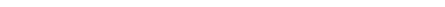
| Category | budget | end of year projected spend |
|---|---|---|
| clerk | 9000 | 17808.88 |
| Admin | 2000 | 1879.48 |
| St Michaels | 290 | 15788.653 |
| RBWM | 200 | 0 |
| greens | 10000 | 1805.933 |
| insurance | 2000 | 1560 |
| youth | 700 | 0 |
| One off | 1250 | 13466.667 |
| web | 700 | 0 |
| hpss | 1 | 1 |
| bank charges | 84 | 72 |
| audit | 750 | 93.333 |
| Champney | 350 | 6925 |